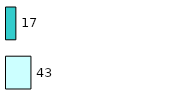
| Category | Series 0 | Series 1 |
|---|---|---|
| 0 | 43 | 17 |